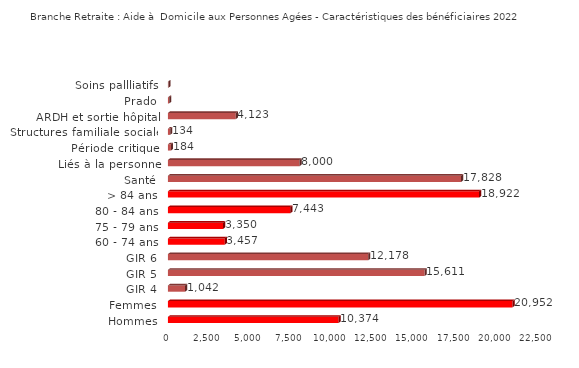
| Category | Series 0 |
|---|---|
| Hommes | 10374 |
| Femmes | 20952 |
| GIR 4 | 1042 |
| GIR 5 | 15611 |
| GIR 6 | 12178 |
| 60 - 74 ans | 3457 |
| 75 - 79 ans | 3350 |
| 80 - 84 ans | 7443 |
| > 84 ans | 18922 |
| Santé | 17828 |
| Liés à la personne | 8000 |
| Période critique | 184 |
| Structures familiale sociale | 134 |
| ARDH et sortie hôpital | 4123 |
| Prado | 73 |
| Soins pallliatifs | 28 |